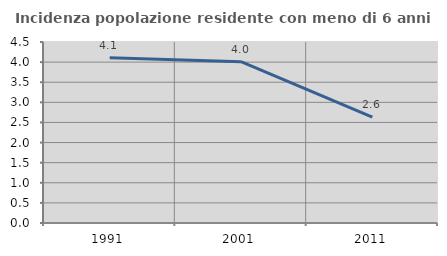
| Category | Incidenza popolazione residente con meno di 6 anni |
|---|---|
| 1991.0 | 4.11 |
| 2001.0 | 4.011 |
| 2011.0 | 2.632 |